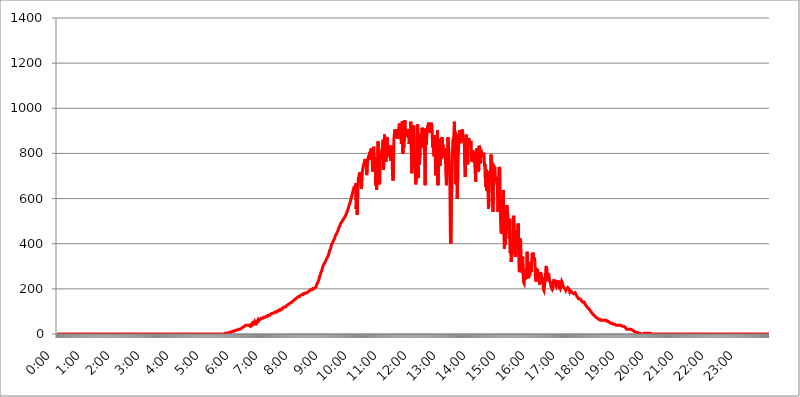
| Category | 2017.08.12. Intenzitás [W/m^2] |
|---|---|
| 0.0 | 0 |
| 0.0006944444444444445 | 0 |
| 0.001388888888888889 | 0 |
| 0.0020833333333333333 | 0 |
| 0.002777777777777778 | 0 |
| 0.003472222222222222 | 0 |
| 0.004166666666666667 | 0 |
| 0.004861111111111111 | 0 |
| 0.005555555555555556 | 0 |
| 0.0062499999999999995 | 0 |
| 0.006944444444444444 | 0 |
| 0.007638888888888889 | 0 |
| 0.008333333333333333 | 0 |
| 0.009027777777777779 | 0 |
| 0.009722222222222222 | 0 |
| 0.010416666666666666 | 0 |
| 0.011111111111111112 | 0 |
| 0.011805555555555555 | 0 |
| 0.012499999999999999 | 0 |
| 0.013194444444444444 | 0 |
| 0.013888888888888888 | 0 |
| 0.014583333333333332 | 0 |
| 0.015277777777777777 | 0 |
| 0.015972222222222224 | 0 |
| 0.016666666666666666 | 0 |
| 0.017361111111111112 | 0 |
| 0.018055555555555557 | 0 |
| 0.01875 | 0 |
| 0.019444444444444445 | 0 |
| 0.02013888888888889 | 0 |
| 0.020833333333333332 | 0 |
| 0.02152777777777778 | 0 |
| 0.022222222222222223 | 0 |
| 0.02291666666666667 | 0 |
| 0.02361111111111111 | 0 |
| 0.024305555555555556 | 0 |
| 0.024999999999999998 | 0 |
| 0.025694444444444447 | 0 |
| 0.02638888888888889 | 0 |
| 0.027083333333333334 | 0 |
| 0.027777777777777776 | 0 |
| 0.02847222222222222 | 0 |
| 0.029166666666666664 | 0 |
| 0.029861111111111113 | 0 |
| 0.030555555555555555 | 0 |
| 0.03125 | 0 |
| 0.03194444444444445 | 0 |
| 0.03263888888888889 | 0 |
| 0.03333333333333333 | 0 |
| 0.034027777777777775 | 0 |
| 0.034722222222222224 | 0 |
| 0.035416666666666666 | 0 |
| 0.036111111111111115 | 0 |
| 0.03680555555555556 | 0 |
| 0.0375 | 0 |
| 0.03819444444444444 | 0 |
| 0.03888888888888889 | 0 |
| 0.03958333333333333 | 0 |
| 0.04027777777777778 | 0 |
| 0.04097222222222222 | 0 |
| 0.041666666666666664 | 0 |
| 0.042361111111111106 | 0 |
| 0.04305555555555556 | 0 |
| 0.043750000000000004 | 0 |
| 0.044444444444444446 | 0 |
| 0.04513888888888889 | 0 |
| 0.04583333333333334 | 0 |
| 0.04652777777777778 | 0 |
| 0.04722222222222222 | 0 |
| 0.04791666666666666 | 0 |
| 0.04861111111111111 | 0 |
| 0.049305555555555554 | 0 |
| 0.049999999999999996 | 0 |
| 0.05069444444444445 | 0 |
| 0.051388888888888894 | 0 |
| 0.052083333333333336 | 0 |
| 0.05277777777777778 | 0 |
| 0.05347222222222222 | 0 |
| 0.05416666666666667 | 0 |
| 0.05486111111111111 | 0 |
| 0.05555555555555555 | 0 |
| 0.05625 | 0 |
| 0.05694444444444444 | 0 |
| 0.057638888888888885 | 0 |
| 0.05833333333333333 | 0 |
| 0.05902777777777778 | 0 |
| 0.059722222222222225 | 0 |
| 0.06041666666666667 | 0 |
| 0.061111111111111116 | 0 |
| 0.06180555555555556 | 0 |
| 0.0625 | 0 |
| 0.06319444444444444 | 0 |
| 0.06388888888888888 | 0 |
| 0.06458333333333334 | 0 |
| 0.06527777777777778 | 0 |
| 0.06597222222222222 | 0 |
| 0.06666666666666667 | 0 |
| 0.06736111111111111 | 0 |
| 0.06805555555555555 | 0 |
| 0.06874999999999999 | 0 |
| 0.06944444444444443 | 0 |
| 0.07013888888888889 | 0 |
| 0.07083333333333333 | 0 |
| 0.07152777777777779 | 0 |
| 0.07222222222222223 | 0 |
| 0.07291666666666667 | 0 |
| 0.07361111111111111 | 0 |
| 0.07430555555555556 | 0 |
| 0.075 | 0 |
| 0.07569444444444444 | 0 |
| 0.0763888888888889 | 0 |
| 0.07708333333333334 | 0 |
| 0.07777777777777778 | 0 |
| 0.07847222222222222 | 0 |
| 0.07916666666666666 | 0 |
| 0.0798611111111111 | 0 |
| 0.08055555555555556 | 0 |
| 0.08125 | 0 |
| 0.08194444444444444 | 0 |
| 0.08263888888888889 | 0 |
| 0.08333333333333333 | 0 |
| 0.08402777777777777 | 0 |
| 0.08472222222222221 | 0 |
| 0.08541666666666665 | 0 |
| 0.08611111111111112 | 0 |
| 0.08680555555555557 | 0 |
| 0.08750000000000001 | 0 |
| 0.08819444444444445 | 0 |
| 0.08888888888888889 | 0 |
| 0.08958333333333333 | 0 |
| 0.09027777777777778 | 0 |
| 0.09097222222222222 | 0 |
| 0.09166666666666667 | 0 |
| 0.09236111111111112 | 0 |
| 0.09305555555555556 | 0 |
| 0.09375 | 0 |
| 0.09444444444444444 | 0 |
| 0.09513888888888888 | 0 |
| 0.09583333333333333 | 0 |
| 0.09652777777777777 | 0 |
| 0.09722222222222222 | 0 |
| 0.09791666666666667 | 0 |
| 0.09861111111111111 | 0 |
| 0.09930555555555555 | 0 |
| 0.09999999999999999 | 0 |
| 0.10069444444444443 | 0 |
| 0.1013888888888889 | 0 |
| 0.10208333333333335 | 0 |
| 0.10277777777777779 | 0 |
| 0.10347222222222223 | 0 |
| 0.10416666666666667 | 0 |
| 0.10486111111111111 | 0 |
| 0.10555555555555556 | 0 |
| 0.10625 | 0 |
| 0.10694444444444444 | 0 |
| 0.1076388888888889 | 0 |
| 0.10833333333333334 | 0 |
| 0.10902777777777778 | 0 |
| 0.10972222222222222 | 0 |
| 0.1111111111111111 | 0 |
| 0.11180555555555556 | 0 |
| 0.11180555555555556 | 0 |
| 0.1125 | 0 |
| 0.11319444444444444 | 0 |
| 0.11388888888888889 | 0 |
| 0.11458333333333333 | 0 |
| 0.11527777777777777 | 0 |
| 0.11597222222222221 | 0 |
| 0.11666666666666665 | 0 |
| 0.1173611111111111 | 0 |
| 0.11805555555555557 | 0 |
| 0.11944444444444445 | 0 |
| 0.12013888888888889 | 0 |
| 0.12083333333333333 | 0 |
| 0.12152777777777778 | 0 |
| 0.12222222222222223 | 0 |
| 0.12291666666666667 | 0 |
| 0.12291666666666667 | 0 |
| 0.12361111111111112 | 0 |
| 0.12430555555555556 | 0 |
| 0.125 | 0 |
| 0.12569444444444444 | 0 |
| 0.12638888888888888 | 0 |
| 0.12708333333333333 | 0 |
| 0.16875 | 0 |
| 0.12847222222222224 | 0 |
| 0.12916666666666668 | 0 |
| 0.12986111111111112 | 0 |
| 0.13055555555555556 | 0 |
| 0.13125 | 0 |
| 0.13194444444444445 | 0 |
| 0.1326388888888889 | 0 |
| 0.13333333333333333 | 0 |
| 0.13402777777777777 | 0 |
| 0.13402777777777777 | 0 |
| 0.13472222222222222 | 0 |
| 0.13541666666666666 | 0 |
| 0.1361111111111111 | 0 |
| 0.13749999999999998 | 0 |
| 0.13819444444444443 | 0 |
| 0.1388888888888889 | 0 |
| 0.13958333333333334 | 0 |
| 0.14027777777777778 | 0 |
| 0.14097222222222222 | 0 |
| 0.14166666666666666 | 0 |
| 0.1423611111111111 | 0 |
| 0.14305555555555557 | 0 |
| 0.14375000000000002 | 0 |
| 0.14444444444444446 | 0 |
| 0.1451388888888889 | 0 |
| 0.1451388888888889 | 0 |
| 0.14652777777777778 | 0 |
| 0.14722222222222223 | 0 |
| 0.14791666666666667 | 0 |
| 0.1486111111111111 | 0 |
| 0.14930555555555555 | 0 |
| 0.15 | 0 |
| 0.15069444444444444 | 0 |
| 0.15138888888888888 | 0 |
| 0.15208333333333332 | 0 |
| 0.15277777777777776 | 0 |
| 0.15347222222222223 | 0 |
| 0.15416666666666667 | 0 |
| 0.15486111111111112 | 0 |
| 0.15555555555555556 | 0 |
| 0.15625 | 0 |
| 0.15694444444444444 | 0 |
| 0.15763888888888888 | 0 |
| 0.15833333333333333 | 0 |
| 0.15902777777777777 | 0 |
| 0.15972222222222224 | 0 |
| 0.16041666666666668 | 0 |
| 0.16111111111111112 | 0 |
| 0.16180555555555556 | 0 |
| 0.1625 | 0 |
| 0.16319444444444445 | 0 |
| 0.1638888888888889 | 0 |
| 0.16458333333333333 | 0 |
| 0.16527777777777777 | 0 |
| 0.16597222222222222 | 0 |
| 0.16666666666666666 | 0 |
| 0.1673611111111111 | 0 |
| 0.16805555555555554 | 0 |
| 0.16874999999999998 | 0 |
| 0.16944444444444443 | 0 |
| 0.17013888888888887 | 0 |
| 0.1708333333333333 | 0 |
| 0.17152777777777775 | 0 |
| 0.17222222222222225 | 0 |
| 0.1729166666666667 | 0 |
| 0.17361111111111113 | 0 |
| 0.17430555555555557 | 0 |
| 0.17500000000000002 | 0 |
| 0.17569444444444446 | 0 |
| 0.1763888888888889 | 0 |
| 0.17708333333333334 | 0 |
| 0.17777777777777778 | 0 |
| 0.17847222222222223 | 0 |
| 0.17916666666666667 | 0 |
| 0.1798611111111111 | 0 |
| 0.18055555555555555 | 0 |
| 0.18125 | 0 |
| 0.18194444444444444 | 0 |
| 0.1826388888888889 | 0 |
| 0.18333333333333335 | 0 |
| 0.1840277777777778 | 0 |
| 0.18472222222222223 | 0 |
| 0.18541666666666667 | 0 |
| 0.18611111111111112 | 0 |
| 0.18680555555555556 | 0 |
| 0.1875 | 0 |
| 0.18819444444444444 | 0 |
| 0.18888888888888888 | 0 |
| 0.18958333333333333 | 0 |
| 0.19027777777777777 | 0 |
| 0.1909722222222222 | 0 |
| 0.19166666666666665 | 0 |
| 0.19236111111111112 | 0 |
| 0.19305555555555554 | 0 |
| 0.19375 | 0 |
| 0.19444444444444445 | 0 |
| 0.1951388888888889 | 0 |
| 0.19583333333333333 | 0 |
| 0.19652777777777777 | 0 |
| 0.19722222222222222 | 0 |
| 0.19791666666666666 | 0 |
| 0.1986111111111111 | 0 |
| 0.19930555555555554 | 0 |
| 0.19999999999999998 | 0 |
| 0.20069444444444443 | 0 |
| 0.20138888888888887 | 0 |
| 0.2020833333333333 | 0 |
| 0.2027777777777778 | 0 |
| 0.2034722222222222 | 0 |
| 0.2041666666666667 | 0 |
| 0.20486111111111113 | 0 |
| 0.20555555555555557 | 0 |
| 0.20625000000000002 | 0 |
| 0.20694444444444446 | 0 |
| 0.2076388888888889 | 0 |
| 0.20833333333333334 | 0 |
| 0.20902777777777778 | 0 |
| 0.20972222222222223 | 0 |
| 0.21041666666666667 | 0 |
| 0.2111111111111111 | 0 |
| 0.21180555555555555 | 0 |
| 0.2125 | 0 |
| 0.21319444444444444 | 0 |
| 0.2138888888888889 | 0 |
| 0.21458333333333335 | 0 |
| 0.2152777777777778 | 0 |
| 0.21597222222222223 | 0 |
| 0.21666666666666667 | 0 |
| 0.21736111111111112 | 0 |
| 0.21805555555555556 | 0 |
| 0.21875 | 0 |
| 0.21944444444444444 | 0 |
| 0.22013888888888888 | 0 |
| 0.22083333333333333 | 0 |
| 0.22152777777777777 | 0 |
| 0.2222222222222222 | 0 |
| 0.22291666666666665 | 0 |
| 0.2236111111111111 | 0 |
| 0.22430555555555556 | 0 |
| 0.225 | 0 |
| 0.22569444444444445 | 0 |
| 0.2263888888888889 | 0 |
| 0.22708333333333333 | 0 |
| 0.22777777777777777 | 0 |
| 0.22847222222222222 | 0 |
| 0.22916666666666666 | 0 |
| 0.2298611111111111 | 0 |
| 0.23055555555555554 | 0 |
| 0.23124999999999998 | 0 |
| 0.23194444444444443 | 0 |
| 0.23263888888888887 | 0 |
| 0.2333333333333333 | 0 |
| 0.2340277777777778 | 0 |
| 0.2347222222222222 | 3.525 |
| 0.2354166666666667 | 3.525 |
| 0.23611111111111113 | 3.525 |
| 0.23680555555555557 | 3.525 |
| 0.23750000000000002 | 3.525 |
| 0.23819444444444446 | 3.525 |
| 0.2388888888888889 | 3.525 |
| 0.23958333333333334 | 3.525 |
| 0.24027777777777778 | 3.525 |
| 0.24097222222222223 | 7.887 |
| 0.24166666666666667 | 7.887 |
| 0.2423611111111111 | 7.887 |
| 0.24305555555555555 | 7.887 |
| 0.24375 | 7.887 |
| 0.24444444444444446 | 7.887 |
| 0.24513888888888888 | 12.257 |
| 0.24583333333333335 | 12.257 |
| 0.2465277777777778 | 12.257 |
| 0.24722222222222223 | 12.257 |
| 0.24791666666666667 | 12.257 |
| 0.24861111111111112 | 12.257 |
| 0.24930555555555556 | 12.257 |
| 0.25 | 16.636 |
| 0.25069444444444444 | 16.636 |
| 0.2513888888888889 | 16.636 |
| 0.2520833333333333 | 16.636 |
| 0.25277777777777777 | 21.024 |
| 0.2534722222222222 | 21.024 |
| 0.25416666666666665 | 21.024 |
| 0.2548611111111111 | 21.024 |
| 0.2555555555555556 | 25.419 |
| 0.25625000000000003 | 21.024 |
| 0.2569444444444445 | 25.419 |
| 0.2576388888888889 | 25.419 |
| 0.25833333333333336 | 25.419 |
| 0.2590277777777778 | 29.823 |
| 0.25972222222222224 | 29.823 |
| 0.2604166666666667 | 29.823 |
| 0.2611111111111111 | 29.823 |
| 0.26180555555555557 | 34.234 |
| 0.2625 | 34.234 |
| 0.26319444444444445 | 34.234 |
| 0.2638888888888889 | 38.653 |
| 0.26458333333333334 | 38.653 |
| 0.2652777777777778 | 38.653 |
| 0.2659722222222222 | 38.653 |
| 0.26666666666666666 | 38.653 |
| 0.2673611111111111 | 43.079 |
| 0.26805555555555555 | 43.079 |
| 0.26875 | 38.653 |
| 0.26944444444444443 | 43.079 |
| 0.2701388888888889 | 38.653 |
| 0.2708333333333333 | 34.234 |
| 0.27152777777777776 | 38.653 |
| 0.2722222222222222 | 47.511 |
| 0.27291666666666664 | 34.234 |
| 0.2736111111111111 | 38.653 |
| 0.2743055555555555 | 51.951 |
| 0.27499999999999997 | 51.951 |
| 0.27569444444444446 | 51.951 |
| 0.27638888888888885 | 51.951 |
| 0.27708333333333335 | 56.398 |
| 0.2777777777777778 | 51.951 |
| 0.27847222222222223 | 38.653 |
| 0.2791666666666667 | 60.85 |
| 0.2798611111111111 | 47.511 |
| 0.28055555555555556 | 56.398 |
| 0.28125 | 60.85 |
| 0.28194444444444444 | 51.951 |
| 0.2826388888888889 | 60.85 |
| 0.2833333333333333 | 65.31 |
| 0.28402777777777777 | 65.31 |
| 0.2847222222222222 | 65.31 |
| 0.28541666666666665 | 65.31 |
| 0.28611111111111115 | 69.775 |
| 0.28680555555555554 | 69.775 |
| 0.28750000000000003 | 69.775 |
| 0.2881944444444445 | 69.775 |
| 0.2888888888888889 | 69.775 |
| 0.28958333333333336 | 74.246 |
| 0.2902777777777778 | 74.246 |
| 0.29097222222222224 | 74.246 |
| 0.2916666666666667 | 74.246 |
| 0.2923611111111111 | 74.246 |
| 0.29305555555555557 | 78.722 |
| 0.29375 | 78.722 |
| 0.29444444444444445 | 78.722 |
| 0.2951388888888889 | 78.722 |
| 0.29583333333333334 | 83.205 |
| 0.2965277777777778 | 83.205 |
| 0.2972222222222222 | 83.205 |
| 0.29791666666666666 | 83.205 |
| 0.2986111111111111 | 83.205 |
| 0.29930555555555555 | 87.692 |
| 0.3 | 87.692 |
| 0.30069444444444443 | 87.692 |
| 0.3013888888888889 | 92.184 |
| 0.3020833333333333 | 92.184 |
| 0.30277777777777776 | 92.184 |
| 0.3034722222222222 | 92.184 |
| 0.30416666666666664 | 92.184 |
| 0.3048611111111111 | 96.682 |
| 0.3055555555555555 | 96.682 |
| 0.30624999999999997 | 96.682 |
| 0.3069444444444444 | 96.682 |
| 0.3076388888888889 | 101.184 |
| 0.30833333333333335 | 101.184 |
| 0.3090277777777778 | 101.184 |
| 0.30972222222222223 | 101.184 |
| 0.3104166666666667 | 105.69 |
| 0.3111111111111111 | 105.69 |
| 0.31180555555555556 | 105.69 |
| 0.3125 | 105.69 |
| 0.31319444444444444 | 110.201 |
| 0.3138888888888889 | 110.201 |
| 0.3145833333333333 | 110.201 |
| 0.31527777777777777 | 110.201 |
| 0.3159722222222222 | 114.716 |
| 0.31666666666666665 | 114.716 |
| 0.31736111111111115 | 114.716 |
| 0.31805555555555554 | 119.235 |
| 0.31875000000000003 | 119.235 |
| 0.3194444444444445 | 119.235 |
| 0.3201388888888889 | 119.235 |
| 0.32083333333333336 | 123.758 |
| 0.3215277777777778 | 123.758 |
| 0.32222222222222224 | 123.758 |
| 0.3229166666666667 | 128.284 |
| 0.3236111111111111 | 128.284 |
| 0.32430555555555557 | 128.284 |
| 0.325 | 132.814 |
| 0.32569444444444445 | 132.814 |
| 0.3263888888888889 | 132.814 |
| 0.32708333333333334 | 137.347 |
| 0.3277777777777778 | 137.347 |
| 0.3284722222222222 | 137.347 |
| 0.32916666666666666 | 141.884 |
| 0.3298611111111111 | 141.884 |
| 0.33055555555555555 | 146.423 |
| 0.33125 | 146.423 |
| 0.33194444444444443 | 146.423 |
| 0.3326388888888889 | 150.964 |
| 0.3333333333333333 | 150.964 |
| 0.3340277777777778 | 155.509 |
| 0.3347222222222222 | 155.509 |
| 0.3354166666666667 | 155.509 |
| 0.3361111111111111 | 160.056 |
| 0.3368055555555556 | 160.056 |
| 0.33749999999999997 | 164.605 |
| 0.33819444444444446 | 164.605 |
| 0.33888888888888885 | 164.605 |
| 0.33958333333333335 | 164.605 |
| 0.34027777777777773 | 169.156 |
| 0.34097222222222223 | 169.156 |
| 0.3416666666666666 | 169.156 |
| 0.3423611111111111 | 173.709 |
| 0.3430555555555555 | 173.709 |
| 0.34375 | 173.709 |
| 0.3444444444444445 | 173.709 |
| 0.3451388888888889 | 178.264 |
| 0.3458333333333334 | 178.264 |
| 0.34652777777777777 | 178.264 |
| 0.34722222222222227 | 178.264 |
| 0.34791666666666665 | 178.264 |
| 0.34861111111111115 | 182.82 |
| 0.34930555555555554 | 182.82 |
| 0.35000000000000003 | 182.82 |
| 0.3506944444444444 | 182.82 |
| 0.3513888888888889 | 182.82 |
| 0.3520833333333333 | 187.378 |
| 0.3527777777777778 | 187.378 |
| 0.3534722222222222 | 191.937 |
| 0.3541666666666667 | 191.937 |
| 0.3548611111111111 | 191.937 |
| 0.35555555555555557 | 196.497 |
| 0.35625 | 196.497 |
| 0.35694444444444445 | 196.497 |
| 0.3576388888888889 | 196.497 |
| 0.35833333333333334 | 201.058 |
| 0.3590277777777778 | 201.058 |
| 0.3597222222222222 | 201.058 |
| 0.36041666666666666 | 201.058 |
| 0.3611111111111111 | 201.058 |
| 0.36180555555555555 | 205.62 |
| 0.3625 | 205.62 |
| 0.36319444444444443 | 210.182 |
| 0.3638888888888889 | 219.309 |
| 0.3645833333333333 | 223.873 |
| 0.3652777777777778 | 228.436 |
| 0.3659722222222222 | 233 |
| 0.3666666666666667 | 237.564 |
| 0.3673611111111111 | 246.689 |
| 0.3680555555555556 | 255.813 |
| 0.36874999999999997 | 260.373 |
| 0.36944444444444446 | 269.49 |
| 0.37013888888888885 | 274.047 |
| 0.37083333333333335 | 278.603 |
| 0.37152777777777773 | 287.709 |
| 0.37222222222222223 | 296.808 |
| 0.3729166666666666 | 301.354 |
| 0.3736111111111111 | 305.898 |
| 0.3743055555555555 | 310.44 |
| 0.375 | 314.98 |
| 0.3756944444444445 | 319.517 |
| 0.3763888888888889 | 324.052 |
| 0.3770833333333334 | 328.584 |
| 0.37777777777777777 | 333.113 |
| 0.37847222222222227 | 337.639 |
| 0.37916666666666665 | 342.162 |
| 0.37986111111111115 | 346.682 |
| 0.38055555555555554 | 351.198 |
| 0.38125000000000003 | 360.221 |
| 0.3819444444444444 | 369.23 |
| 0.3826388888888889 | 373.729 |
| 0.3833333333333333 | 378.224 |
| 0.3840277777777778 | 387.202 |
| 0.3847222222222222 | 396.164 |
| 0.3854166666666667 | 400.638 |
| 0.3861111111111111 | 405.108 |
| 0.38680555555555557 | 409.574 |
| 0.3875 | 414.035 |
| 0.38819444444444445 | 418.492 |
| 0.3888888888888889 | 422.943 |
| 0.38958333333333334 | 431.833 |
| 0.3902777777777778 | 436.27 |
| 0.3909722222222222 | 440.702 |
| 0.39166666666666666 | 445.129 |
| 0.3923611111111111 | 449.551 |
| 0.39305555555555555 | 453.968 |
| 0.39375 | 458.38 |
| 0.39444444444444443 | 462.786 |
| 0.3951388888888889 | 471.582 |
| 0.3958333333333333 | 475.972 |
| 0.3965277777777778 | 480.356 |
| 0.3972222222222222 | 489.108 |
| 0.3979166666666667 | 493.475 |
| 0.3986111111111111 | 493.475 |
| 0.3993055555555556 | 497.836 |
| 0.39999999999999997 | 502.192 |
| 0.40069444444444446 | 506.542 |
| 0.40138888888888885 | 510.885 |
| 0.40208333333333335 | 510.885 |
| 0.40277777777777773 | 515.223 |
| 0.40347222222222223 | 515.223 |
| 0.4041666666666666 | 523.88 |
| 0.4048611111111111 | 523.88 |
| 0.4055555555555555 | 532.513 |
| 0.40625 | 536.82 |
| 0.4069444444444445 | 545.416 |
| 0.4076388888888889 | 549.704 |
| 0.4083333333333334 | 558.261 |
| 0.40902777777777777 | 566.793 |
| 0.40972222222222227 | 571.049 |
| 0.41041666666666665 | 579.542 |
| 0.41111111111111115 | 588.009 |
| 0.41180555555555554 | 596.45 |
| 0.41250000000000003 | 604.864 |
| 0.4131944444444444 | 613.252 |
| 0.4138888888888889 | 621.613 |
| 0.4145833333333333 | 629.948 |
| 0.4152777777777778 | 634.105 |
| 0.4159722222222222 | 646.537 |
| 0.4166666666666667 | 654.791 |
| 0.4173611111111111 | 642.4 |
| 0.41805555555555557 | 654.791 |
| 0.41875 | 667.123 |
| 0.41944444444444445 | 553.986 |
| 0.4201388888888889 | 667.123 |
| 0.42083333333333334 | 528.2 |
| 0.4215277777777778 | 642.4 |
| 0.4222222222222222 | 687.544 |
| 0.42291666666666666 | 695.666 |
| 0.4236111111111111 | 691.608 |
| 0.42430555555555555 | 715.858 |
| 0.425 | 715.858 |
| 0.42569444444444443 | 671.22 |
| 0.4263888888888889 | 642.4 |
| 0.4270833333333333 | 658.909 |
| 0.4277777777777778 | 715.858 |
| 0.4284722222222222 | 731.896 |
| 0.4291666666666667 | 735.89 |
| 0.4298611111111111 | 751.803 |
| 0.4305555555555556 | 751.803 |
| 0.43124999999999997 | 767.62 |
| 0.43194444444444446 | 775.492 |
| 0.43263888888888885 | 775.492 |
| 0.43333333333333335 | 739.877 |
| 0.43402777777777773 | 703.762 |
| 0.43472222222222223 | 731.896 |
| 0.4354166666666666 | 767.62 |
| 0.4361111111111111 | 763.674 |
| 0.4368055555555555 | 791.169 |
| 0.4375 | 783.342 |
| 0.4381944444444445 | 806.757 |
| 0.4388888888888889 | 771.559 |
| 0.4395833333333334 | 810.641 |
| 0.44027777777777777 | 822.26 |
| 0.44097222222222227 | 798.974 |
| 0.44166666666666665 | 771.559 |
| 0.44236111111111115 | 719.877 |
| 0.44305555555555554 | 787.258 |
| 0.44375000000000003 | 829.981 |
| 0.4444444444444444 | 763.674 |
| 0.4451388888888889 | 727.896 |
| 0.4458333333333333 | 783.342 |
| 0.4465277777777778 | 658.909 |
| 0.4472222222222222 | 695.666 |
| 0.4479166666666667 | 638.256 |
| 0.4486111111111111 | 759.723 |
| 0.44930555555555557 | 695.666 |
| 0.45 | 853.029 |
| 0.45069444444444445 | 759.723 |
| 0.4513888888888889 | 783.342 |
| 0.45208333333333334 | 663.019 |
| 0.4527777777777778 | 767.62 |
| 0.4534722222222222 | 795.074 |
| 0.45416666666666666 | 771.559 |
| 0.4548611111111111 | 771.559 |
| 0.45555555555555555 | 818.392 |
| 0.45625 | 826.123 |
| 0.45694444444444443 | 860.676 |
| 0.4576388888888889 | 727.896 |
| 0.4583333333333333 | 795.074 |
| 0.4590277777777778 | 883.516 |
| 0.4597222222222222 | 845.365 |
| 0.4604166666666667 | 833.834 |
| 0.4611111111111111 | 763.674 |
| 0.4618055555555556 | 759.723 |
| 0.46249999999999997 | 872.114 |
| 0.46319444444444446 | 853.029 |
| 0.46388888888888885 | 810.641 |
| 0.46458333333333335 | 787.258 |
| 0.46527777777777773 | 822.26 |
| 0.46597222222222223 | 791.169 |
| 0.4666666666666666 | 833.834 |
| 0.4673611111111111 | 767.62 |
| 0.4680555555555555 | 806.757 |
| 0.46875 | 833.834 |
| 0.4694444444444445 | 822.26 |
| 0.4701388888888889 | 711.832 |
| 0.4708333333333334 | 679.395 |
| 0.47152777777777777 | 707.8 |
| 0.47222222222222227 | 864.493 |
| 0.47291666666666665 | 887.309 |
| 0.47361111111111115 | 906.223 |
| 0.47430555555555554 | 887.309 |
| 0.47500000000000003 | 879.719 |
| 0.4756944444444444 | 868.305 |
| 0.4763888888888889 | 906.223 |
| 0.4770833333333333 | 894.885 |
| 0.4777777777777778 | 864.493 |
| 0.4784722222222222 | 894.885 |
| 0.4791666666666667 | 917.534 |
| 0.4798611111111111 | 932.576 |
| 0.48055555555555557 | 921.298 |
| 0.48125 | 909.996 |
| 0.48194444444444445 | 872.114 |
| 0.4826388888888889 | 841.526 |
| 0.48333333333333334 | 917.534 |
| 0.4840277777777778 | 943.832 |
| 0.4847222222222222 | 798.974 |
| 0.48541666666666666 | 853.029 |
| 0.4861111111111111 | 856.855 |
| 0.48680555555555555 | 845.365 |
| 0.4875 | 947.58 |
| 0.48819444444444443 | 887.309 |
| 0.4888888888888889 | 891.099 |
| 0.4895833333333333 | 894.885 |
| 0.4902777777777778 | 894.885 |
| 0.4909722222222222 | 872.114 |
| 0.4916666666666667 | 883.516 |
| 0.4923611111111111 | 894.885 |
| 0.4930555555555556 | 906.223 |
| 0.49374999999999997 | 841.526 |
| 0.49444444444444446 | 906.223 |
| 0.49513888888888885 | 894.885 |
| 0.49583333333333335 | 940.082 |
| 0.49652777777777773 | 822.26 |
| 0.49722222222222223 | 711.832 |
| 0.4979166666666666 | 872.114 |
| 0.4986111111111111 | 806.757 |
| 0.4993055555555555 | 822.26 |
| 0.5 | 925.06 |
| 0.5006944444444444 | 755.766 |
| 0.5013888888888889 | 739.877 |
| 0.5020833333333333 | 711.832 |
| 0.5027777777777778 | 663.019 |
| 0.5034722222222222 | 699.717 |
| 0.5041666666666667 | 687.544 |
| 0.5048611111111111 | 887.309 |
| 0.5055555555555555 | 928.819 |
| 0.50625 | 691.608 |
| 0.5069444444444444 | 802.868 |
| 0.5076388888888889 | 751.803 |
| 0.5083333333333333 | 771.559 |
| 0.5090277777777777 | 787.258 |
| 0.5097222222222222 | 887.309 |
| 0.5104166666666666 | 875.918 |
| 0.5111111111111112 | 853.029 |
| 0.5118055555555555 | 913.766 |
| 0.5125000000000001 | 909.996 |
| 0.5131944444444444 | 868.305 |
| 0.513888888888889 | 826.123 |
| 0.5145833333333333 | 837.682 |
| 0.5152777777777778 | 795.074 |
| 0.5159722222222222 | 658.909 |
| 0.5166666666666667 | 909.996 |
| 0.517361111111111 | 837.682 |
| 0.5180555555555556 | 864.493 |
| 0.5187499999999999 | 894.885 |
| 0.5194444444444445 | 917.534 |
| 0.5201388888888888 | 917.534 |
| 0.5208333333333334 | 936.33 |
| 0.5215277777777778 | 932.576 |
| 0.5222222222222223 | 898.668 |
| 0.5229166666666667 | 891.099 |
| 0.5236111111111111 | 906.223 |
| 0.5243055555555556 | 936.33 |
| 0.525 | 940.082 |
| 0.5256944444444445 | 917.534 |
| 0.5263888888888889 | 826.123 |
| 0.5270833333333333 | 837.682 |
| 0.5277777777777778 | 818.392 |
| 0.5284722222222222 | 787.258 |
| 0.5291666666666667 | 879.719 |
| 0.5298611111111111 | 864.493 |
| 0.5305555555555556 | 703.762 |
| 0.53125 | 841.526 |
| 0.5319444444444444 | 849.199 |
| 0.5326388888888889 | 872.114 |
| 0.5333333333333333 | 902.447 |
| 0.5340277777777778 | 658.909 |
| 0.5347222222222222 | 814.519 |
| 0.5354166666666667 | 864.493 |
| 0.5361111111111111 | 837.682 |
| 0.5368055555555555 | 743.859 |
| 0.5375 | 822.26 |
| 0.5381944444444444 | 810.641 |
| 0.5388888888888889 | 775.492 |
| 0.5395833333333333 | 872.114 |
| 0.5402777777777777 | 826.123 |
| 0.5409722222222222 | 837.682 |
| 0.5416666666666666 | 837.682 |
| 0.5423611111111112 | 833.834 |
| 0.5430555555555555 | 783.342 |
| 0.5437500000000001 | 822.26 |
| 0.5444444444444444 | 783.342 |
| 0.545138888888889 | 707.8 |
| 0.5458333333333333 | 658.909 |
| 0.5465277777777778 | 743.859 |
| 0.5472222222222222 | 791.169 |
| 0.5479166666666667 | 872.114 |
| 0.548611111111111 | 833.834 |
| 0.5493055555555556 | 814.519 |
| 0.5499999999999999 | 755.766 |
| 0.5506944444444445 | 667.123 |
| 0.5513888888888888 | 427.39 |
| 0.5520833333333334 | 400.638 |
| 0.5527777777777778 | 592.233 |
| 0.5534722222222223 | 638.256 |
| 0.5541666666666667 | 763.674 |
| 0.5548611111111111 | 856.855 |
| 0.5555555555555556 | 864.493 |
| 0.55625 | 879.719 |
| 0.5569444444444445 | 940.082 |
| 0.5576388888888889 | 872.114 |
| 0.5583333333333333 | 894.885 |
| 0.5590277777777778 | 663.019 |
| 0.5597222222222222 | 671.22 |
| 0.5604166666666667 | 887.309 |
| 0.5611111111111111 | 600.661 |
| 0.5618055555555556 | 723.889 |
| 0.5625 | 795.074 |
| 0.5631944444444444 | 849.199 |
| 0.5638888888888889 | 875.918 |
| 0.5645833333333333 | 902.447 |
| 0.5652777777777778 | 883.516 |
| 0.5659722222222222 | 845.365 |
| 0.5666666666666667 | 887.309 |
| 0.5673611111111111 | 891.099 |
| 0.5680555555555555 | 906.223 |
| 0.56875 | 887.309 |
| 0.5694444444444444 | 864.493 |
| 0.5701388888888889 | 856.855 |
| 0.5708333333333333 | 868.305 |
| 0.5715277777777777 | 747.834 |
| 0.5722222222222222 | 695.666 |
| 0.5729166666666666 | 837.682 |
| 0.5736111111111112 | 883.516 |
| 0.5743055555555555 | 833.834 |
| 0.5750000000000001 | 868.305 |
| 0.5756944444444444 | 751.803 |
| 0.576388888888889 | 845.365 |
| 0.5770833333333333 | 868.305 |
| 0.5777777777777778 | 864.493 |
| 0.5784722222222222 | 849.199 |
| 0.5791666666666667 | 845.365 |
| 0.579861111111111 | 845.365 |
| 0.5805555555555556 | 849.199 |
| 0.5812499999999999 | 763.674 |
| 0.5819444444444445 | 802.868 |
| 0.5826388888888888 | 814.519 |
| 0.5833333333333334 | 814.519 |
| 0.5840277777777778 | 791.169 |
| 0.5847222222222223 | 759.723 |
| 0.5854166666666667 | 802.868 |
| 0.5861111111111111 | 798.974 |
| 0.5868055555555556 | 675.311 |
| 0.5875 | 802.868 |
| 0.5881944444444445 | 822.26 |
| 0.5888888888888889 | 751.803 |
| 0.5895833333333333 | 779.42 |
| 0.5902777777777778 | 802.868 |
| 0.5909722222222222 | 719.877 |
| 0.5916666666666667 | 833.834 |
| 0.5923611111111111 | 829.981 |
| 0.5930555555555556 | 822.26 |
| 0.59375 | 755.766 |
| 0.5944444444444444 | 814.519 |
| 0.5951388888888889 | 806.757 |
| 0.5958333333333333 | 798.974 |
| 0.5965277777777778 | 798.974 |
| 0.5972222222222222 | 791.169 |
| 0.5979166666666667 | 802.868 |
| 0.5986111111111111 | 795.074 |
| 0.5993055555555555 | 739.877 |
| 0.6 | 751.803 |
| 0.6006944444444444 | 663.019 |
| 0.6013888888888889 | 650.667 |
| 0.6020833333333333 | 727.896 |
| 0.6027777777777777 | 634.105 |
| 0.6034722222222222 | 719.877 |
| 0.6041666666666666 | 629.948 |
| 0.6048611111111112 | 553.986 |
| 0.6055555555555555 | 600.661 |
| 0.6062500000000001 | 699.717 |
| 0.6069444444444444 | 667.123 |
| 0.607638888888889 | 707.8 |
| 0.6083333333333333 | 795.074 |
| 0.6090277777777778 | 751.803 |
| 0.6097222222222222 | 679.395 |
| 0.6104166666666667 | 679.395 |
| 0.611111111111111 | 541.121 |
| 0.6118055555555556 | 671.22 |
| 0.6124999999999999 | 743.859 |
| 0.6131944444444445 | 747.834 |
| 0.6138888888888888 | 735.89 |
| 0.6145833333333334 | 675.311 |
| 0.6152777777777778 | 695.666 |
| 0.6159722222222223 | 695.666 |
| 0.6166666666666667 | 699.717 |
| 0.6173611111111111 | 658.909 |
| 0.6180555555555556 | 541.121 |
| 0.61875 | 629.948 |
| 0.6194444444444445 | 739.877 |
| 0.6201388888888889 | 739.877 |
| 0.6208333333333333 | 731.896 |
| 0.6215277777777778 | 528.2 |
| 0.6222222222222222 | 458.38 |
| 0.6229166666666667 | 445.129 |
| 0.6236111111111111 | 506.542 |
| 0.6243055555555556 | 493.475 |
| 0.625 | 609.062 |
| 0.6256944444444444 | 638.256 |
| 0.6263888888888889 | 445.129 |
| 0.6270833333333333 | 378.224 |
| 0.6277777777777778 | 409.574 |
| 0.6284722222222222 | 396.164 |
| 0.6291666666666667 | 480.356 |
| 0.6298611111111111 | 519.555 |
| 0.6305555555555555 | 571.049 |
| 0.63125 | 541.121 |
| 0.6319444444444444 | 532.513 |
| 0.6326388888888889 | 493.475 |
| 0.6333333333333333 | 445.129 |
| 0.6340277777777777 | 422.943 |
| 0.6347222222222222 | 510.885 |
| 0.6354166666666666 | 360.221 |
| 0.6361111111111112 | 409.574 |
| 0.6368055555555555 | 319.517 |
| 0.6375000000000001 | 391.685 |
| 0.6381944444444444 | 387.202 |
| 0.638888888888889 | 355.712 |
| 0.6395833333333333 | 453.968 |
| 0.6402777777777778 | 523.88 |
| 0.6409722222222222 | 418.492 |
| 0.6416666666666667 | 369.23 |
| 0.642361111111111 | 342.162 |
| 0.6430555555555556 | 458.38 |
| 0.6437499999999999 | 427.39 |
| 0.6444444444444445 | 405.108 |
| 0.6451388888888888 | 382.715 |
| 0.6458333333333334 | 382.715 |
| 0.6465277777777778 | 489.108 |
| 0.6472222222222223 | 351.198 |
| 0.6479166666666667 | 274.047 |
| 0.6486111111111111 | 278.603 |
| 0.6493055555555556 | 422.943 |
| 0.65 | 409.574 |
| 0.6506944444444445 | 314.98 |
| 0.6513888888888889 | 287.709 |
| 0.6520833333333333 | 278.603 |
| 0.6527777777777778 | 342.162 |
| 0.6534722222222222 | 260.373 |
| 0.6541666666666667 | 228.436 |
| 0.6548611111111111 | 223.873 |
| 0.6555555555555556 | 251.251 |
| 0.65625 | 242.127 |
| 0.6569444444444444 | 287.709 |
| 0.6576388888888889 | 246.689 |
| 0.6583333333333333 | 292.259 |
| 0.6590277777777778 | 364.728 |
| 0.6597222222222222 | 287.709 |
| 0.6604166666666667 | 251.251 |
| 0.6611111111111111 | 246.689 |
| 0.6618055555555555 | 305.898 |
| 0.6625 | 260.373 |
| 0.6631944444444444 | 264.932 |
| 0.6638888888888889 | 319.517 |
| 0.6645833333333333 | 274.047 |
| 0.6652777777777777 | 301.354 |
| 0.6659722222222222 | 355.712 |
| 0.6666666666666666 | 346.682 |
| 0.6673611111111111 | 360.221 |
| 0.6680555555555556 | 342.162 |
| 0.6687500000000001 | 342.162 |
| 0.6694444444444444 | 333.113 |
| 0.6701388888888888 | 310.44 |
| 0.6708333333333334 | 233 |
| 0.6715277777777778 | 260.373 |
| 0.6722222222222222 | 292.259 |
| 0.6729166666666666 | 269.49 |
| 0.6736111111111112 | 287.709 |
| 0.6743055555555556 | 255.813 |
| 0.6749999999999999 | 233 |
| 0.6756944444444444 | 255.813 |
| 0.6763888888888889 | 219.309 |
| 0.6770833333333334 | 251.251 |
| 0.6777777777777777 | 274.047 |
| 0.6784722222222223 | 274.047 |
| 0.6791666666666667 | 255.813 |
| 0.6798611111111111 | 223.873 |
| 0.6805555555555555 | 251.251 |
| 0.68125 | 233 |
| 0.6819444444444445 | 196.497 |
| 0.6826388888888889 | 191.937 |
| 0.6833333333333332 | 210.182 |
| 0.6840277777777778 | 228.436 |
| 0.6847222222222222 | 255.813 |
| 0.6854166666666667 | 296.808 |
| 0.686111111111111 | 301.354 |
| 0.6868055555555556 | 269.49 |
| 0.6875 | 246.689 |
| 0.6881944444444444 | 233 |
| 0.688888888888889 | 269.49 |
| 0.6895833333333333 | 260.373 |
| 0.6902777777777778 | 242.127 |
| 0.6909722222222222 | 233 |
| 0.6916666666666668 | 228.436 |
| 0.6923611111111111 | 210.182 |
| 0.6930555555555555 | 205.62 |
| 0.69375 | 201.058 |
| 0.6944444444444445 | 196.497 |
| 0.6951388888888889 | 201.058 |
| 0.6958333333333333 | 228.436 |
| 0.6965277777777777 | 242.127 |
| 0.6972222222222223 | 242.127 |
| 0.6979166666666666 | 228.436 |
| 0.6986111111111111 | 223.873 |
| 0.6993055555555556 | 214.746 |
| 0.7000000000000001 | 210.182 |
| 0.7006944444444444 | 210.182 |
| 0.7013888888888888 | 228.436 |
| 0.7020833333333334 | 237.564 |
| 0.7027777777777778 | 223.873 |
| 0.7034722222222222 | 214.746 |
| 0.7041666666666666 | 219.309 |
| 0.7048611111111112 | 205.62 |
| 0.7055555555555556 | 201.058 |
| 0.7062499999999999 | 201.058 |
| 0.7069444444444444 | 219.309 |
| 0.7076388888888889 | 233 |
| 0.7083333333333334 | 228.436 |
| 0.7090277777777777 | 219.309 |
| 0.7097222222222223 | 210.182 |
| 0.7104166666666667 | 205.62 |
| 0.7111111111111111 | 205.62 |
| 0.7118055555555555 | 201.058 |
| 0.7125 | 196.497 |
| 0.7131944444444445 | 191.937 |
| 0.7138888888888889 | 196.497 |
| 0.7145833333333332 | 196.497 |
| 0.7152777777777778 | 196.497 |
| 0.7159722222222222 | 205.62 |
| 0.7166666666666667 | 205.62 |
| 0.717361111111111 | 201.058 |
| 0.7180555555555556 | 196.497 |
| 0.71875 | 187.378 |
| 0.7194444444444444 | 191.937 |
| 0.720138888888889 | 191.937 |
| 0.7208333333333333 | 191.937 |
| 0.7215277777777778 | 187.378 |
| 0.7222222222222222 | 182.82 |
| 0.7229166666666668 | 182.82 |
| 0.7236111111111111 | 182.82 |
| 0.7243055555555555 | 178.264 |
| 0.725 | 178.264 |
| 0.7256944444444445 | 178.264 |
| 0.7263888888888889 | 182.82 |
| 0.7270833333333333 | 178.264 |
| 0.7277777777777777 | 173.709 |
| 0.7284722222222223 | 169.156 |
| 0.7291666666666666 | 164.605 |
| 0.7298611111111111 | 164.605 |
| 0.7305555555555556 | 160.056 |
| 0.7312500000000001 | 155.509 |
| 0.7319444444444444 | 155.509 |
| 0.7326388888888888 | 155.509 |
| 0.7333333333333334 | 155.509 |
| 0.7340277777777778 | 155.509 |
| 0.7347222222222222 | 150.964 |
| 0.7354166666666666 | 146.423 |
| 0.7361111111111112 | 146.423 |
| 0.7368055555555556 | 141.884 |
| 0.7374999999999999 | 141.884 |
| 0.7381944444444444 | 141.884 |
| 0.7388888888888889 | 141.884 |
| 0.7395833333333334 | 137.347 |
| 0.7402777777777777 | 137.347 |
| 0.7409722222222223 | 128.284 |
| 0.7416666666666667 | 128.284 |
| 0.7423611111111111 | 123.758 |
| 0.7430555555555555 | 119.235 |
| 0.74375 | 119.235 |
| 0.7444444444444445 | 114.716 |
| 0.7451388888888889 | 114.716 |
| 0.7458333333333332 | 110.201 |
| 0.7465277777777778 | 110.201 |
| 0.7472222222222222 | 105.69 |
| 0.7479166666666667 | 101.184 |
| 0.748611111111111 | 101.184 |
| 0.7493055555555556 | 96.682 |
| 0.75 | 92.184 |
| 0.7506944444444444 | 92.184 |
| 0.751388888888889 | 87.692 |
| 0.7520833333333333 | 87.692 |
| 0.7527777777777778 | 83.205 |
| 0.7534722222222222 | 83.205 |
| 0.7541666666666668 | 78.722 |
| 0.7548611111111111 | 78.722 |
| 0.7555555555555555 | 74.246 |
| 0.75625 | 74.246 |
| 0.7569444444444445 | 74.246 |
| 0.7576388888888889 | 69.775 |
| 0.7583333333333333 | 69.775 |
| 0.7590277777777777 | 65.31 |
| 0.7597222222222223 | 65.31 |
| 0.7604166666666666 | 65.31 |
| 0.7611111111111111 | 65.31 |
| 0.7618055555555556 | 60.85 |
| 0.7625000000000001 | 60.85 |
| 0.7631944444444444 | 60.85 |
| 0.7638888888888888 | 60.85 |
| 0.7645833333333334 | 60.85 |
| 0.7652777777777778 | 60.85 |
| 0.7659722222222222 | 60.85 |
| 0.7666666666666666 | 60.85 |
| 0.7673611111111112 | 60.85 |
| 0.7680555555555556 | 60.85 |
| 0.7687499999999999 | 60.85 |
| 0.7694444444444444 | 60.85 |
| 0.7701388888888889 | 60.85 |
| 0.7708333333333334 | 56.398 |
| 0.7715277777777777 | 56.398 |
| 0.7722222222222223 | 56.398 |
| 0.7729166666666667 | 56.398 |
| 0.7736111111111111 | 56.398 |
| 0.7743055555555555 | 51.951 |
| 0.775 | 51.951 |
| 0.7756944444444445 | 51.951 |
| 0.7763888888888889 | 47.511 |
| 0.7770833333333332 | 47.511 |
| 0.7777777777777778 | 47.511 |
| 0.7784722222222222 | 47.511 |
| 0.7791666666666667 | 47.511 |
| 0.779861111111111 | 43.079 |
| 0.7805555555555556 | 43.079 |
| 0.78125 | 43.079 |
| 0.7819444444444444 | 43.079 |
| 0.782638888888889 | 38.653 |
| 0.7833333333333333 | 38.653 |
| 0.7840277777777778 | 38.653 |
| 0.7847222222222222 | 38.653 |
| 0.7854166666666668 | 38.653 |
| 0.7861111111111111 | 38.653 |
| 0.7868055555555555 | 38.653 |
| 0.7875 | 38.653 |
| 0.7881944444444445 | 38.653 |
| 0.7888888888888889 | 38.653 |
| 0.7895833333333333 | 38.653 |
| 0.7902777777777777 | 38.653 |
| 0.7909722222222223 | 34.234 |
| 0.7916666666666666 | 34.234 |
| 0.7923611111111111 | 34.234 |
| 0.7930555555555556 | 34.234 |
| 0.7937500000000001 | 34.234 |
| 0.7944444444444444 | 34.234 |
| 0.7951388888888888 | 29.823 |
| 0.7958333333333334 | 29.823 |
| 0.7965277777777778 | 29.823 |
| 0.7972222222222222 | 29.823 |
| 0.7979166666666666 | 25.419 |
| 0.7986111111111112 | 21.024 |
| 0.7993055555555556 | 21.024 |
| 0.7999999999999999 | 21.024 |
| 0.8006944444444444 | 21.024 |
| 0.8013888888888889 | 21.024 |
| 0.8020833333333334 | 21.024 |
| 0.8027777777777777 | 21.024 |
| 0.8034722222222223 | 21.024 |
| 0.8041666666666667 | 21.024 |
| 0.8048611111111111 | 21.024 |
| 0.8055555555555555 | 16.636 |
| 0.80625 | 16.636 |
| 0.8069444444444445 | 16.636 |
| 0.8076388888888889 | 16.636 |
| 0.8083333333333332 | 12.257 |
| 0.8090277777777778 | 12.257 |
| 0.8097222222222222 | 12.257 |
| 0.8104166666666667 | 12.257 |
| 0.811111111111111 | 7.887 |
| 0.8118055555555556 | 7.887 |
| 0.8125 | 7.887 |
| 0.8131944444444444 | 7.887 |
| 0.813888888888889 | 3.525 |
| 0.8145833333333333 | 3.525 |
| 0.8152777777777778 | 3.525 |
| 0.8159722222222222 | 3.525 |
| 0.8166666666666668 | 3.525 |
| 0.8173611111111111 | 3.525 |
| 0.8180555555555555 | 3.525 |
| 0.81875 | 0 |
| 0.8194444444444445 | 0 |
| 0.8201388888888889 | 0 |
| 0.8208333333333333 | 0 |
| 0.8215277777777777 | 0 |
| 0.8222222222222223 | 0 |
| 0.8229166666666666 | 0 |
| 0.8236111111111111 | 3.525 |
| 0.8243055555555556 | 3.525 |
| 0.8250000000000001 | 0 |
| 0.8256944444444444 | 3.525 |
| 0.8263888888888888 | 3.525 |
| 0.8270833333333334 | 3.525 |
| 0.8277777777777778 | 3.525 |
| 0.8284722222222222 | 3.525 |
| 0.8291666666666666 | 3.525 |
| 0.8298611111111112 | 3.525 |
| 0.8305555555555556 | 3.525 |
| 0.8312499999999999 | 3.525 |
| 0.8319444444444444 | 3.525 |
| 0.8326388888888889 | 3.525 |
| 0.8333333333333334 | 0 |
| 0.8340277777777777 | 0 |
| 0.8347222222222223 | 0 |
| 0.8354166666666667 | 0 |
| 0.8361111111111111 | 0 |
| 0.8368055555555555 | 0 |
| 0.8375 | 0 |
| 0.8381944444444445 | 0 |
| 0.8388888888888889 | 0 |
| 0.8395833333333332 | 0 |
| 0.8402777777777778 | 0 |
| 0.8409722222222222 | 0 |
| 0.8416666666666667 | 0 |
| 0.842361111111111 | 0 |
| 0.8430555555555556 | 0 |
| 0.84375 | 0 |
| 0.8444444444444444 | 0 |
| 0.845138888888889 | 0 |
| 0.8458333333333333 | 0 |
| 0.8465277777777778 | 0 |
| 0.8472222222222222 | 0 |
| 0.8479166666666668 | 0 |
| 0.8486111111111111 | 0 |
| 0.8493055555555555 | 0 |
| 0.85 | 0 |
| 0.8506944444444445 | 0 |
| 0.8513888888888889 | 0 |
| 0.8520833333333333 | 0 |
| 0.8527777777777777 | 0 |
| 0.8534722222222223 | 0 |
| 0.8541666666666666 | 0 |
| 0.8548611111111111 | 0 |
| 0.8555555555555556 | 0 |
| 0.8562500000000001 | 0 |
| 0.8569444444444444 | 0 |
| 0.8576388888888888 | 0 |
| 0.8583333333333334 | 0 |
| 0.8590277777777778 | 0 |
| 0.8597222222222222 | 0 |
| 0.8604166666666666 | 0 |
| 0.8611111111111112 | 0 |
| 0.8618055555555556 | 0 |
| 0.8624999999999999 | 0 |
| 0.8631944444444444 | 0 |
| 0.8638888888888889 | 0 |
| 0.8645833333333334 | 0 |
| 0.8652777777777777 | 0 |
| 0.8659722222222223 | 0 |
| 0.8666666666666667 | 0 |
| 0.8673611111111111 | 0 |
| 0.8680555555555555 | 0 |
| 0.86875 | 0 |
| 0.8694444444444445 | 0 |
| 0.8701388888888889 | 0 |
| 0.8708333333333332 | 0 |
| 0.8715277777777778 | 0 |
| 0.8722222222222222 | 0 |
| 0.8729166666666667 | 0 |
| 0.873611111111111 | 0 |
| 0.8743055555555556 | 0 |
| 0.875 | 0 |
| 0.8756944444444444 | 0 |
| 0.876388888888889 | 0 |
| 0.8770833333333333 | 0 |
| 0.8777777777777778 | 0 |
| 0.8784722222222222 | 0 |
| 0.8791666666666668 | 0 |
| 0.8798611111111111 | 0 |
| 0.8805555555555555 | 0 |
| 0.88125 | 0 |
| 0.8819444444444445 | 0 |
| 0.8826388888888889 | 0 |
| 0.8833333333333333 | 0 |
| 0.8840277777777777 | 0 |
| 0.8847222222222223 | 0 |
| 0.8854166666666666 | 0 |
| 0.8861111111111111 | 0 |
| 0.8868055555555556 | 0 |
| 0.8875000000000001 | 0 |
| 0.8881944444444444 | 0 |
| 0.8888888888888888 | 0 |
| 0.8895833333333334 | 0 |
| 0.8902777777777778 | 0 |
| 0.8909722222222222 | 0 |
| 0.8916666666666666 | 0 |
| 0.8923611111111112 | 0 |
| 0.8930555555555556 | 0 |
| 0.8937499999999999 | 0 |
| 0.8944444444444444 | 0 |
| 0.8951388888888889 | 0 |
| 0.8958333333333334 | 0 |
| 0.8965277777777777 | 0 |
| 0.8972222222222223 | 0 |
| 0.8979166666666667 | 0 |
| 0.8986111111111111 | 0 |
| 0.8993055555555555 | 0 |
| 0.9 | 0 |
| 0.9006944444444445 | 0 |
| 0.9013888888888889 | 0 |
| 0.9020833333333332 | 0 |
| 0.9027777777777778 | 0 |
| 0.9034722222222222 | 0 |
| 0.9041666666666667 | 0 |
| 0.904861111111111 | 0 |
| 0.9055555555555556 | 0 |
| 0.90625 | 0 |
| 0.9069444444444444 | 0 |
| 0.907638888888889 | 0 |
| 0.9083333333333333 | 0 |
| 0.9090277777777778 | 0 |
| 0.9097222222222222 | 0 |
| 0.9104166666666668 | 0 |
| 0.9111111111111111 | 0 |
| 0.9118055555555555 | 0 |
| 0.9125 | 0 |
| 0.9131944444444445 | 0 |
| 0.9138888888888889 | 0 |
| 0.9145833333333333 | 0 |
| 0.9152777777777777 | 0 |
| 0.9159722222222223 | 0 |
| 0.9166666666666666 | 0 |
| 0.9173611111111111 | 0 |
| 0.9180555555555556 | 0 |
| 0.9187500000000001 | 0 |
| 0.9194444444444444 | 0 |
| 0.9201388888888888 | 0 |
| 0.9208333333333334 | 0 |
| 0.9215277777777778 | 0 |
| 0.9222222222222222 | 0 |
| 0.9229166666666666 | 0 |
| 0.9236111111111112 | 0 |
| 0.9243055555555556 | 0 |
| 0.9249999999999999 | 0 |
| 0.9256944444444444 | 0 |
| 0.9263888888888889 | 0 |
| 0.9270833333333334 | 0 |
| 0.9277777777777777 | 0 |
| 0.9284722222222223 | 0 |
| 0.9291666666666667 | 0 |
| 0.9298611111111111 | 0 |
| 0.9305555555555555 | 0 |
| 0.93125 | 0 |
| 0.9319444444444445 | 0 |
| 0.9326388888888889 | 0 |
| 0.9333333333333332 | 0 |
| 0.9340277777777778 | 0 |
| 0.9347222222222222 | 0 |
| 0.9354166666666667 | 0 |
| 0.936111111111111 | 0 |
| 0.9368055555555556 | 0 |
| 0.9375 | 0 |
| 0.9381944444444444 | 0 |
| 0.938888888888889 | 0 |
| 0.9395833333333333 | 0 |
| 0.9402777777777778 | 0 |
| 0.9409722222222222 | 0 |
| 0.9416666666666668 | 0 |
| 0.9423611111111111 | 0 |
| 0.9430555555555555 | 0 |
| 0.94375 | 0 |
| 0.9444444444444445 | 0 |
| 0.9451388888888889 | 0 |
| 0.9458333333333333 | 0 |
| 0.9465277777777777 | 0 |
| 0.9472222222222223 | 0 |
| 0.9479166666666666 | 0 |
| 0.9486111111111111 | 0 |
| 0.9493055555555556 | 0 |
| 0.9500000000000001 | 0 |
| 0.9506944444444444 | 0 |
| 0.9513888888888888 | 0 |
| 0.9520833333333334 | 0 |
| 0.9527777777777778 | 0 |
| 0.9534722222222222 | 0 |
| 0.9541666666666666 | 0 |
| 0.9548611111111112 | 0 |
| 0.9555555555555556 | 0 |
| 0.9562499999999999 | 0 |
| 0.9569444444444444 | 0 |
| 0.9576388888888889 | 0 |
| 0.9583333333333334 | 0 |
| 0.9590277777777777 | 0 |
| 0.9597222222222223 | 0 |
| 0.9604166666666667 | 0 |
| 0.9611111111111111 | 0 |
| 0.9618055555555555 | 0 |
| 0.9625 | 0 |
| 0.9631944444444445 | 0 |
| 0.9638888888888889 | 0 |
| 0.9645833333333332 | 0 |
| 0.9652777777777778 | 0 |
| 0.9659722222222222 | 0 |
| 0.9666666666666667 | 0 |
| 0.967361111111111 | 0 |
| 0.9680555555555556 | 0 |
| 0.96875 | 0 |
| 0.9694444444444444 | 0 |
| 0.970138888888889 | 0 |
| 0.9708333333333333 | 0 |
| 0.9715277777777778 | 0 |
| 0.9722222222222222 | 0 |
| 0.9729166666666668 | 0 |
| 0.9736111111111111 | 0 |
| 0.9743055555555555 | 0 |
| 0.975 | 0 |
| 0.9756944444444445 | 0 |
| 0.9763888888888889 | 0 |
| 0.9770833333333333 | 0 |
| 0.9777777777777777 | 0 |
| 0.9784722222222223 | 0 |
| 0.9791666666666666 | 0 |
| 0.9798611111111111 | 0 |
| 0.9805555555555556 | 0 |
| 0.9812500000000001 | 0 |
| 0.9819444444444444 | 0 |
| 0.9826388888888888 | 0 |
| 0.9833333333333334 | 0 |
| 0.9840277777777778 | 0 |
| 0.9847222222222222 | 0 |
| 0.9854166666666666 | 0 |
| 0.9861111111111112 | 0 |
| 0.9868055555555556 | 0 |
| 0.9874999999999999 | 0 |
| 0.9881944444444444 | 0 |
| 0.9888888888888889 | 0 |
| 0.9895833333333334 | 0 |
| 0.9902777777777777 | 0 |
| 0.9909722222222223 | 0 |
| 0.9916666666666667 | 0 |
| 0.9923611111111111 | 0 |
| 0.9930555555555555 | 0 |
| 0.99375 | 0 |
| 0.9944444444444445 | 0 |
| 0.9951388888888889 | 0 |
| 0.9958333333333332 | 0 |
| 0.9965277777777778 | 0 |
| 0.9972222222222222 | 0 |
| 0.9979166666666667 | 0 |
| 0.998611111111111 | 0 |
| 0.9993055555555556 | 0 |